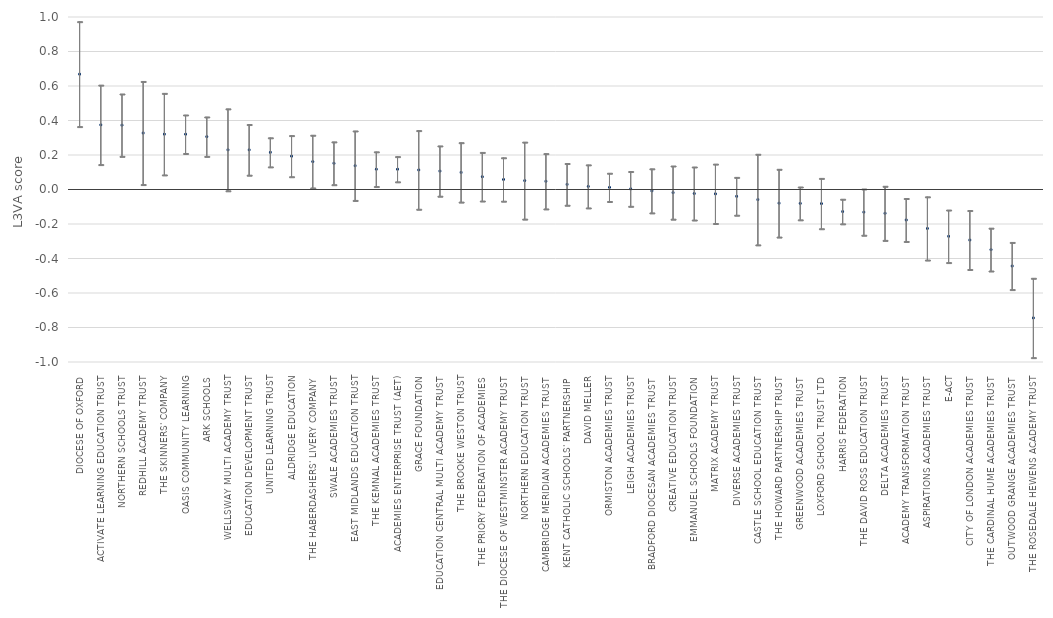
| Category | VA_MAT_ACVQ | UCI_MAT_ACVQ | LCI_MAT_ACVQ |
|---|---|---|---|
| DIOCESE OF OXFORD | 0.669 | 0.973 | 0.365 |
| ACTIVATE LEARNING EDUCATION TRUST | 0.375 | 0.605 | 0.144 |
| NORTHERN SCHOOLS TRUST | 0.373 | 0.554 | 0.192 |
| REDHILL ACADEMY TRUST | 0.327 | 0.626 | 0.029 |
| THE SKINNERS' COMPANY | 0.321 | 0.557 | 0.084 |
| OASIS COMMUNITY LEARNING | 0.32 | 0.432 | 0.209 |
| ARK SCHOOLS | 0.306 | 0.42 | 0.192 |
| WELLSWAY MULTI ACADEMY TRUST | 0.23 | 0.467 | -0.008 |
| EDUCATION DEVELOPMENT TRUST | 0.23 | 0.377 | 0.083 |
| UNITED LEARNING TRUST | 0.215 | 0.3 | 0.131 |
| ALDRIDGE EDUCATION | 0.193 | 0.312 | 0.074 |
| THE HABERDASHERS' LIVERY COMPANY | 0.162 | 0.315 | 0.009 |
| SWALE ACADEMIES TRUST | 0.152 | 0.276 | 0.028 |
| EAST MIDLANDS EDUCATION TRUST | 0.138 | 0.339 | -0.063 |
| THE KEMNAL ACADEMIES TRUST | 0.118 | 0.218 | 0.017 |
| ACADEMIES ENTERPRISE TRUST (AET) | 0.117 | 0.191 | 0.044 |
| GRACE FOUNDATION | 0.113 | 0.341 | -0.115 |
| EDUCATION CENTRAL MULTI ACADEMY TRUST | 0.107 | 0.253 | -0.039 |
| THE BROOKE WESTON TRUST | 0.099 | 0.271 | -0.073 |
| THE PRIORY FEDERATION OF ACADEMIES | 0.074 | 0.215 | -0.067 |
| THE DIOCESE OF WESTMINSTER ACADEMY TRUST | 0.058 | 0.184 | -0.068 |
| NORTHERN EDUCATION TRUST | 0.051 | 0.275 | -0.172 |
| CAMBRIDGE MERIDIAN ACADEMIES TRUST | 0.048 | 0.208 | -0.113 |
| KENT CATHOLIC SCHOOLS' PARTNERSHIP | 0.03 | 0.151 | -0.091 |
| DAVID MELLER | 0.018 | 0.143 | -0.107 |
| ORMISTON ACADEMIES TRUST | 0.012 | 0.094 | -0.069 |
| LEIGH ACADEMIES TRUST | 0.003 | 0.104 | -0.097 |
| BRADFORD DIOCESAN ACADEMIES TRUST | -0.008 | 0.12 | -0.136 |
| CREATIVE EDUCATION TRUST | -0.018 | 0.136 | -0.172 |
| EMMANUEL SCHOOLS FOUNDATION | -0.023 | 0.131 | -0.177 |
| MATRIX ACADEMY TRUST | -0.025 | 0.147 | -0.197 |
| DIVERSE ACADEMIES TRUST | -0.039 | 0.07 | -0.149 |
| CASTLE SCHOOL EDUCATION TRUST | -0.058 | 0.204 | -0.321 |
| THE HOWARD PARTNERSHIP TRUST | -0.079 | 0.117 | -0.276 |
| GREENWOOD ACADEMIES TRUST | -0.081 | 0.015 | -0.176 |
| LOXFORD SCHOOL TRUST LTD | -0.082 | 0.064 | -0.227 |
| HARRIS FEDERATION | -0.128 | -0.056 | -0.199 |
| THE DAVID ROSS EDUCATION TRUST | -0.131 | 0.003 | -0.265 |
| DELTA ACADEMIES TRUST | -0.138 | 0.019 | -0.295 |
| ACADEMY TRANSFORMATION TRUST | -0.177 | -0.052 | -0.301 |
| ASPIRATIONS ACADEMIES TRUST | -0.226 | -0.043 | -0.409 |
| E-ACT | -0.271 | -0.119 | -0.424 |
| CITY OF LONDON ACADEMIES TRUST | -0.293 | -0.122 | -0.464 |
| THE CARDINAL HUME ACADEMIES TRUST | -0.348 | -0.224 | -0.473 |
| OUTWOOD GRANGE ACADEMIES TRUST | -0.444 | -0.307 | -0.58 |
| THE ROSEDALE HEWENS ACADEMY TRUST | -0.745 | -0.515 | -0.975 |